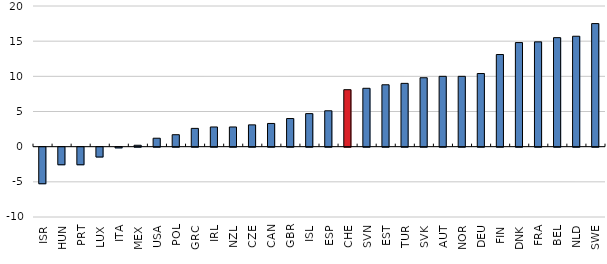
| Category | Total  |
|---|---|
| ISR | -5.2 |
| HUN | -2.5 |
| PRT | -2.5 |
| LUX | -1.4 |
| ITA | -0.1 |
| MEX | 0.2 |
| USA | 1.2 |
| POL | 1.7 |
| GRC | 2.6 |
| IRL | 2.8 |
| NZL | 2.8 |
| CZE | 3.1 |
| CAN | 3.3 |
| GBR | 4 |
| ISL | 4.7 |
| ESP | 5.1 |
| CHE | 8.1 |
| SVN | 8.3 |
| EST | 8.8 |
| TUR | 9 |
| SVK | 9.8 |
| AUT | 10 |
| NOR | 10 |
| DEU | 10.4 |
| FIN | 13.1 |
| DNK | 14.8 |
| FRA | 14.9 |
| BEL | 15.5 |
| NLD | 15.7 |
| SWE | 17.5 |